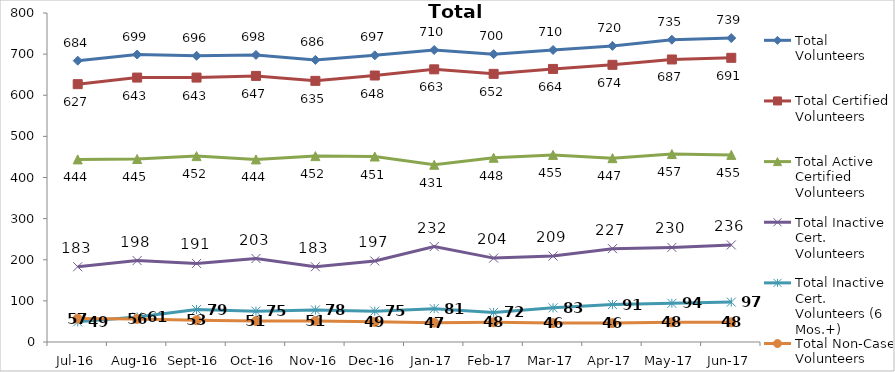
| Category | Total Volunteers | Total Certified Volunteers | Total Active Certified Volunteers | Total Inactive Cert. Volunteers | Total Inactive Cert. Volunteers (6 Mos.+) | Total Non-Case Volunteers |
|---|---|---|---|---|---|---|
| Jul-16 | 684 | 627 | 444 | 183 | 49 | 57 |
| Aug-16 | 699 | 643 | 445 | 198 | 61 | 56 |
| Sep-16 | 696 | 643 | 452 | 191 | 79 | 53 |
| Oct-16 | 698 | 647 | 444 | 203 | 75 | 51 |
| Nov-16 | 686 | 635 | 452 | 183 | 78 | 51 |
| Dec-16 | 697 | 648 | 451 | 197 | 75 | 49 |
| Jan-17 | 710 | 663 | 431 | 232 | 81 | 47 |
| Feb-17 | 700 | 652 | 448 | 204 | 72 | 48 |
| Mar-17 | 710 | 664 | 455 | 209 | 83 | 46 |
| Apr-17 | 720 | 674 | 447 | 227 | 91 | 46 |
| May-17 | 735 | 687 | 457 | 230 | 94 | 48 |
| Jun-17 | 739 | 691 | 455 | 236 | 97 | 48 |